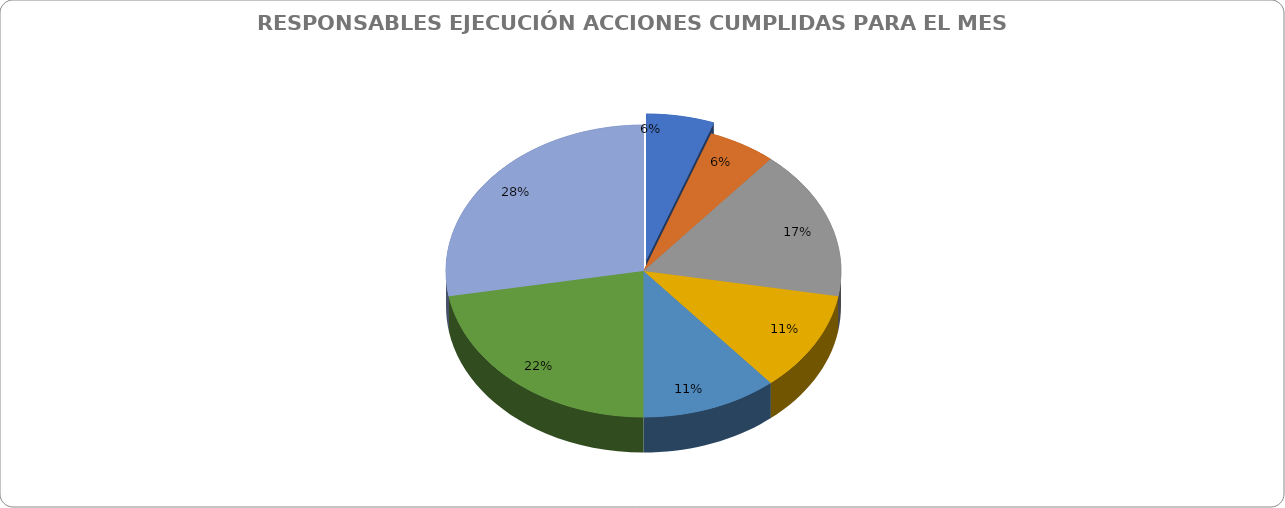
| Category | Cuenta de ESTADO DE LA ACCION |
|---|---|
| Subsecretaría de Gestión Juridica | 1 |
| Subsecretaría de Gestión de la Movilidad | 1 |
| Subsecretaria de Gestion Corporativa | 3 |
| Subdirector de Control de Tránsito y Transporte | 2 |
| SUBDIRECCIÓN FINANCIERA | 2 |
| Subdirección de Señalización | 4 |
| Subdirección de Contravenciones | 5 |